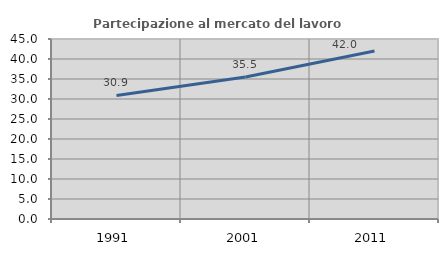
| Category | Partecipazione al mercato del lavoro  femminile |
|---|---|
| 1991.0 | 30.878 |
| 2001.0 | 35.508 |
| 2011.0 | 41.983 |